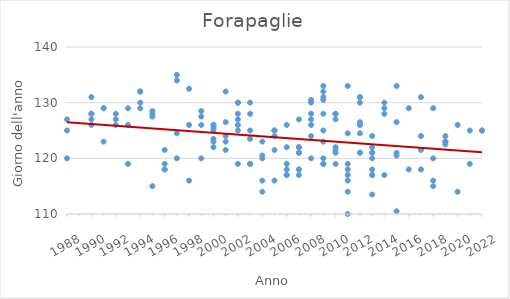
| Category | Series 0 |
|---|---|
| 1988.0 | 127 |
| 1988.0 | 125 |
| 1988.0 | 120 |
| 1990.0 | 131 |
| 1990.0 | 127 |
| 1990.0 | 128 |
| 1990.0 | 128 |
| 1990.0 | 126 |
| 1991.0 | 129 |
| 1991.0 | 129 |
| 1991.0 | 123 |
| 1992.0 | 128 |
| 1992.0 | 126 |
| 1992.0 | 127 |
| 1993.0 | 129 |
| 1993.0 | 119 |
| 1993.0 | 126 |
| 1994.0 | 132 |
| 1994.0 | 132 |
| 1994.0 | 130 |
| 1994.0 | 129 |
| 1995.0 | 128 |
| 1995.0 | 128.5 |
| 1995.0 | 115 |
| 1995.0 | 127.5 |
| 1996.0 | 121.5 |
| 1996.0 | 118 |
| 1996.0 | 119 |
| 1996.0 | 118 |
| 1997.0 | 124.5 |
| 1997.0 | 134 |
| 1997.0 | 135 |
| 1997.0 | 120 |
| 1998.0 | 116 |
| 1998.0 | 132.5 |
| 1998.0 | 126 |
| 1999.0 | 127.5 |
| 1999.0 | 120 |
| 1999.0 | 128.5 |
| 1999.0 | 126 |
| 2000.0 | 123.5 |
| 2000.0 | 126 |
| 2000.0 | 122 |
| 2000.0 | 126 |
| 2000.0 | 123 |
| 2000.0 | 125.5 |
| 2000.0 | 125 |
| 2001.0 | 126.5 |
| 2001.0 | 132 |
| 2001.0 | 123 |
| 2001.0 | 124 |
| 2001.0 | 121.5 |
| 2002.0 | 126 |
| 2002.0 | 130 |
| 2002.0 | 130 |
| 2002.0 | 128 |
| 2002.0 | 127 |
| 2002.0 | 125 |
| 2002.0 | 119 |
| 2003.0 | 123.5 |
| 2003.0 | 119 |
| 2003.0 | 125 |
| 2003.0 | 130 |
| 2003.0 | 119 |
| 2003.0 | 128 |
| 2004.0 | 116 |
| 2004.0 | 114 |
| 2004.0 | 120 |
| 2004.0 | 120.5 |
| 2004.0 | 123 |
| 2005.0 | 125 |
| 2005.0 | 121.5 |
| 2005.0 | 116 |
| 2005.0 | 125 |
| 2005.0 | 124 |
| 2006.0 | 122 |
| 2006.0 | 117 |
| 2006.0 | 126 |
| 2006.0 | 119 |
| 2006.0 | 118 |
| 2006.0 | 117 |
| 2007.0 | 121 |
| 2007.0 | 122 |
| 2007.0 | 117 |
| 2007.0 | 122 |
| 2007.0 | 118 |
| 2007.0 | 121 |
| 2007.0 | 127 |
| 2007.0 | 118 |
| 2008.0 | 120 |
| 2008.0 | 124 |
| 2008.0 | 126 |
| 2008.0 | 130 |
| 2008.0 | 127 |
| 2008.0 | 130.5 |
| 2008.0 | 128 |
| 2009.0 | 120 |
| 2009.0 | 119 |
| 2009.0 | 125 |
| 2009.0 | 130.5 |
| 2009.0 | 128 |
| 2009.0 | 133 |
| 2009.0 | 119 |
| 2009.0 | 123 |
| 2009.0 | 131 |
| 2009.0 | 132 |
| 2010.0 | 122 |
| 2010.0 | 121.5 |
| 2010.0 | 128 |
| 2010.0 | 127 |
| 2010.0 | 119 |
| 2010.0 | 128 |
| 2010.0 | 121 |
| 2011.0 | 110 |
| 2011.0 | 133 |
| 2011.0 | 114 |
| 2011.0 | 117 |
| 2011.0 | 119 |
| 2011.0 | 118 |
| 2011.0 | 124.5 |
| 2011.0 | 116 |
| 2012.0 | 124.5 |
| 2012.0 | 130 |
| 2012.0 | 126 |
| 2012.0 | 121 |
| 2012.0 | 121 |
| 2012.0 | 131 |
| 2012.0 | 131 |
| 2012.0 | 126 |
| 2012.0 | 126.5 |
| 2013.0 | 113.5 |
| 2013.0 | 121 |
| 2013.0 | 120 |
| 2013.0 | 122 |
| 2013.0 | 124 |
| 2013.0 | 117 |
| 2013.0 | 107 |
| 2013.0 | 121 |
| 2013.0 | 117 |
| 2013.0 | 118 |
| 2014.0 | 130 |
| 2014.0 | 128 |
| 2014.0 | 129 |
| 2014.0 | 117 |
| 2015.0 | 110.5 |
| 2015.0 | 133 |
| 2015.0 | 121 |
| 2015.0 | 126.5 |
| 2015.0 | 120.5 |
| 2016.0 | 129 |
| 2016.0 | 118 |
| 2017.0 | 121.5 |
| 2017.0 | 124 |
| 2017.0 | 118 |
| 2017.0 | 131 |
| 2018.0 | 120 |
| 2018.0 | 116 |
| 2018.0 | 115 |
| 2018.0 | 129 |
| 2019.0 | 123 |
| 2019.0 | 123 |
| 2019.0 | 124 |
| 2019.0 | 122.5 |
| 2020.0 | 126 |
| 2020.0 | 114 |
| 2021.0 | 125 |
| 2021.0 | 119 |
| 2022.0 | 125 |
| 2022.0 | 125 |